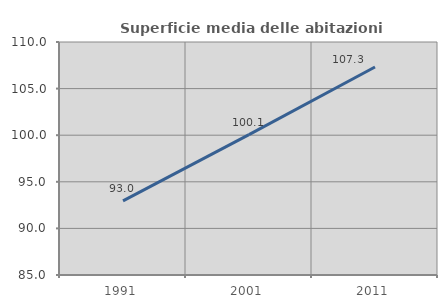
| Category | Superficie media delle abitazioni occupate |
|---|---|
| 1991.0 | 92.951 |
| 2001.0 | 100.068 |
| 2011.0 | 107.313 |